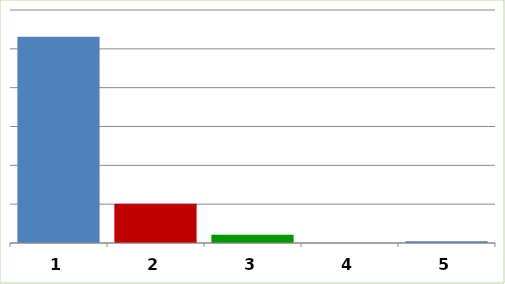
| Category | Series 0 |
|---|---|
| 0 | 53142659.26 |
| 1 | 10137335 |
| 2 | 2124000 |
| 3 | 0 |
| 4 | 450000 |